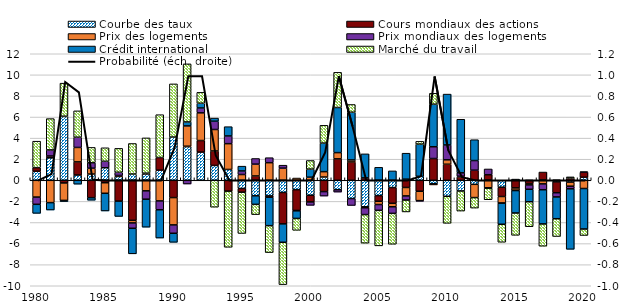
| Category | Courbe des taux | Cours mondiaux des actions | Prix des logements | Prix mondiaux des logements | Crédit international | Marché du travail |
|---|---|---|---|---|---|---|
| 1980.0 | 0.859 | 0.342 | -1.592 | -0.685 | -0.858 | 2.508 |
| 1981.0 | 2.131 | 0.176 | -2.117 | 0.573 | -0.699 | 2.97 |
| 1982.0 | 6.051 | -0.254 | -1.652 | 0.028 | -0.109 | 3.134 |
| 1983.0 | 0.501 | 1.245 | 1.371 | 0.973 | -0.366 | 2.498 |
| 1984.0 | 0.593 | -1.647 | 0.555 | 0.509 | -0.241 | 1.462 |
| 1985.0 | 1.19 | -0.231 | -1 | 0.614 | -1.677 | 1.28 |
| 1986.0 | 0.36 | -1.974 | 0.099 | 0.299 | -1.453 | 2.272 |
| 1987.0 | 0.591 | -3.795 | -0.249 | -0.506 | -2.422 | 2.9 |
| 1988.0 | 0.603 | 0.074 | -1.003 | -0.789 | -2.654 | 3.343 |
| 1989.0 | 0.962 | 1.198 | -1.956 | -0.839 | -2.68 | 4.063 |
| 1990.0 | 4.103 | -1.638 | -2.594 | -0.791 | -0.856 | 5.04 |
| 1991.0 | 3.188 | 0.043 | 1.928 | -0.351 | 0.378 | 5.508 |
| 1992.0 | 2.674 | 1.098 | 2.624 | 0.466 | 0.444 | 1.036 |
| 1993.0 | 1.408 | 1.372 | 2.038 | 0.783 | 0.299 | -2.55 |
| 1994.0 | 1.027 | -1.03 | 2.447 | 0.732 | 0.879 | -5.324 |
| 1995.0 | -0.771 | -0.356 | 0.549 | 0.336 | 0.457 | -3.913 |
| 1996.0 | -1.472 | 0.412 | 1.12 | 0.537 | -0.811 | -0.974 |
| 1997.0 | -1.482 | -0.121 | 1.671 | 0.474 | -2.699 | -2.552 |
| 1998.0 | -1.153 | -2.981 | 1.153 | 0.281 | -1.743 | -4.013 |
| 1999.0 | -0.886 | -1.971 | 0.215 | -0.041 | -0.717 | -1.127 |
| 2000.0 | -1.417 | -0.638 | 0.295 | -0.32 | 0.765 | 0.819 |
| 2001.0 | 0.312 | -1.07 | 0.509 | -0.425 | 2.71 | 1.684 |
| 2002.0 | -0.895 | 2.035 | 0.589 | -0.222 | 4.282 | 3.334 |
| 2003.0 | -1.731 | 1.739 | 0.194 | -0.655 | 4.518 | 0.739 |
| 2004.0 | -2.511 | 0.23 | -0.094 | -0.645 | 2.278 | -2.714 |
| 2005.0 | -1.452 | -0.534 | -0.311 | -0.552 | 1.231 | -3.368 |
| 2006.0 | -0.685 | -1.497 | -0.33 | -0.624 | 0.892 | -2.931 |
| 2007.0 | 0.108 | -0.679 | -0.805 | -0.389 | 2.463 | -1.126 |
| 2008.0 | 0.377 | -1.036 | -0.891 | -0.054 | 3.055 | 0.262 |
| 2009.0 | -0.333 | 2.064 | -0.103 | 1.118 | 4.038 | 1.029 |
| 2010.0 | -1.514 | 1.523 | 0.419 | 1.412 | 4.822 | -2.569 |
| 2011.0 | -1.013 | 0.318 | 0.07 | 0.318 | 5.084 | -1.907 |
| 2012.0 | -0.382 | 0.959 | -1.256 | 0.915 | 1.976 | -1.001 |
| 2013.0 | 0.026 | 0.502 | -0.713 | 0.547 | -0.034 | -1.098 |
| 2014.0 | -0.653 | -0.882 | -0.631 | -0.002 | -2.002 | -1.704 |
| 2015.0 | 0.115 | -0.725 | -0.218 | -0.03 | -2.129 | -2.117 |
| 2016.0 | -0.008 | -0.305 | -0.127 | -0.409 | -1.185 | -2.369 |
| 2017.0 | 0.04 | 0.744 | -0.342 | -0.552 | -3.247 | -2.111 |
| 2018.0 | -0.149 | -1.029 | 0.025 | -0.403 | -2.063 | -1.685 |
| 2019.0 | -0.17 | 0.215 | -0.388 | -0.249 | -5.735 | 0.109 |
| 2020.0 | 0.292 | 0.475 | -0.777 | 0.043 | -3.844 | -0.614 |